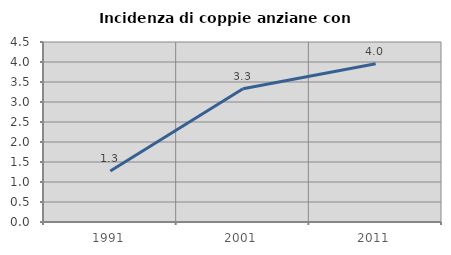
| Category | Incidenza di coppie anziane con figli |
|---|---|
| 1991.0 | 1.277 |
| 2001.0 | 3.333 |
| 2011.0 | 3.955 |